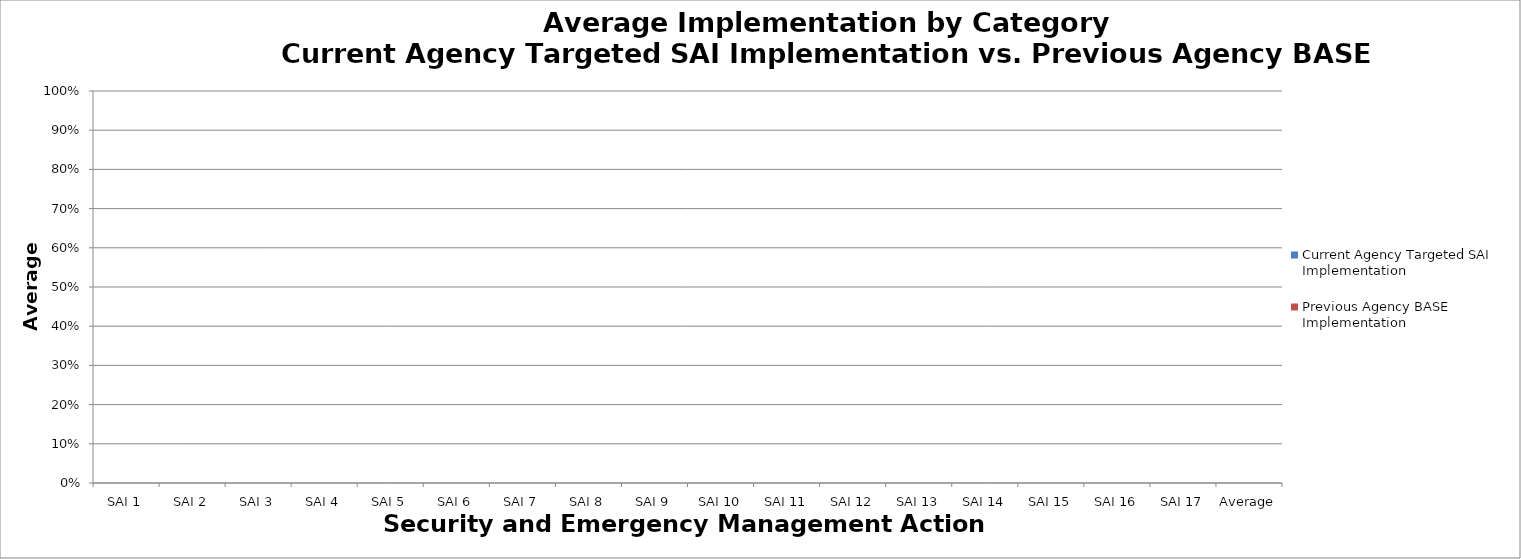
| Category | Current Agency Targeted SAI Implementation | Previous Agency BASE Implementation |
|---|---|---|
| SAI 1 | 0 | 0 |
| SAI 2 | 0 | 0 |
| SAI 3 | 0 | 0 |
| SAI 4 | 0 | 0 |
| SAI 5 | 0 | 0 |
| SAI 6 | 0 | 0 |
| SAI 7 | 0 | 0 |
| SAI 8 | 0 | 0 |
| SAI 9 | 0 | 0 |
| SAI 10 | 0 | 0 |
| SAI 11 | 0 | 0 |
| SAI 12 | 0 | 0 |
| SAI 13 | 0 | 0 |
| SAI 14 | 0 | 0 |
| SAI 15 | 0 | 0 |
| SAI 16 | 0 | 0 |
| SAI 17 | 0 | 0 |
| Average | 0 | 0 |